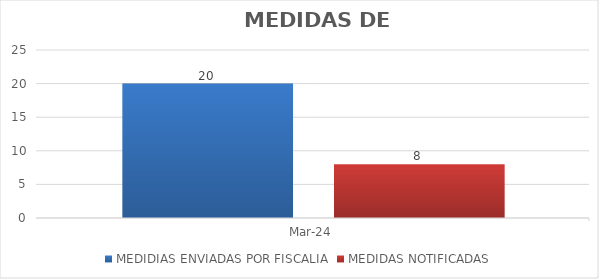
| Category | MEDIDIAS ENVIADAS POR FISCALIA | MEDIDAS NOTIFICADAS |
|---|---|---|
| 2024-03-01 | 20 | 8 |